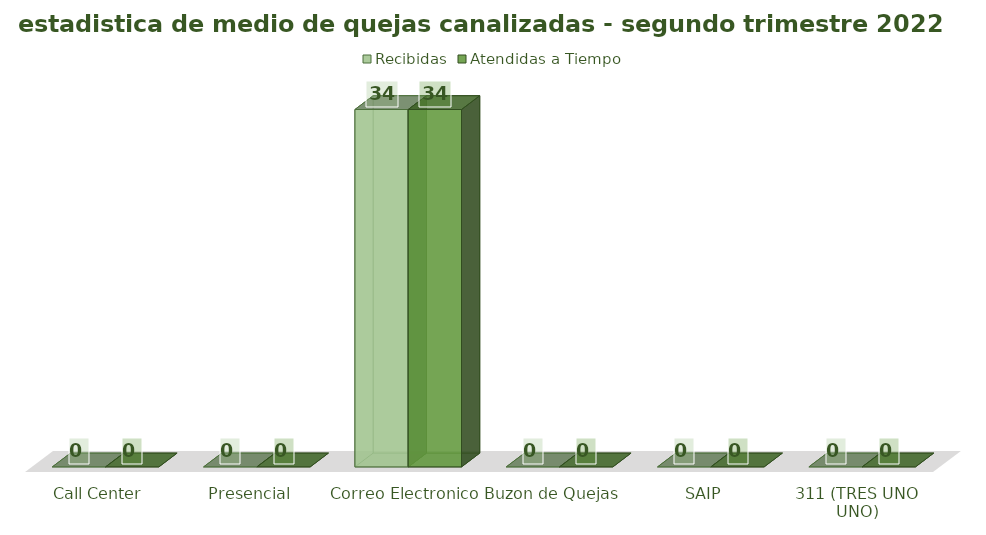
| Category | Recibidas | Atendidas a Tiempo |
|---|---|---|
| Call Center | 0 | 0 |
| Presencial | 0 | 0 |
| Correo Electronico  | 34 | 34 |
| Buzon de Quejas | 0 | 0 |
| SAIP | 0 | 0 |
| 311 (TRES UNO UNO) | 0 | 0 |